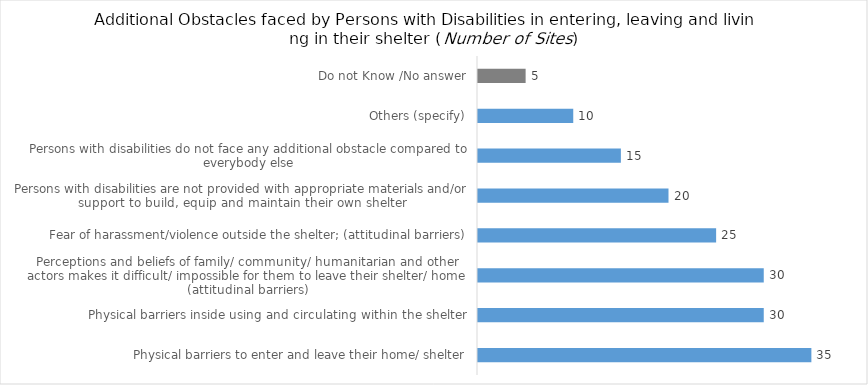
| Category | Additional Obstacles faced by Persons with Disabilities in entering, leaving and living in their shelter |
|---|---|
| Physical barriers to enter and leave their home/ shelter | 35 |
| Physical barriers inside using and circulating within the shelter | 30 |
| Perceptions and beliefs of family/ community/ humanitarian and other actors makes it difficult/ impossible for them to leave their shelter/ home (attitudinal barriers) | 30 |
| Fear of harassment/violence outside the shelter; (attitudinal barriers) | 25 |
| Persons with disabilities are not provided with appropriate materials and/or support to build, equip and maintain their own shelter | 20 |
| Persons with disabilities do not face any additional obstacle compared to everybody else | 15 |
| Others (specify) | 10 |
| Do not Know /No answer | 5 |